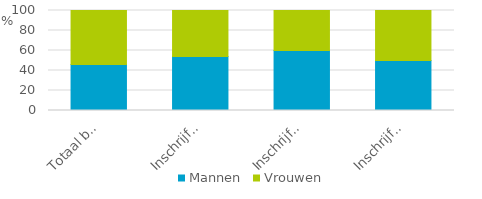
| Category | Mannen | Vrouwen |
|---|---|---|
| Totaal buitenlandse werknemers | 46 | 54 |
| Inschrijfplichtig | 54 | 46 |
| Inschrijfplichtig; ingeschreven in BRP | 60 | 40 |
| Inschrijfplichtig; niet ingeschreven in BRP | 50 | 50 |